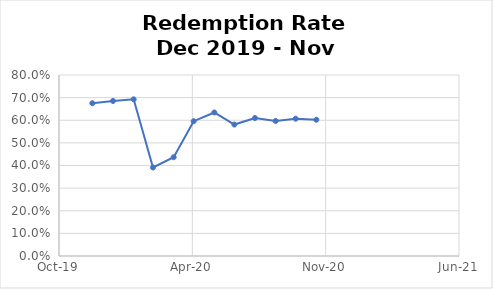
| Category | Series 0 |
|---|---|
| 43800.0 | 0.675 |
| 43831.0 | 0.685 |
| 43862.0 | 0.692 |
| 43891.0 | 0.391 |
| 43922.0 | 0.437 |
| 43952.0 | 0.596 |
| 43983.0 | 0.634 |
| 44013.0 | 0.581 |
| 44044.0 | 0.61 |
| 44075.0 | 0.597 |
| 44105.0 | 0.607 |
| 44136.0 | 0.602 |